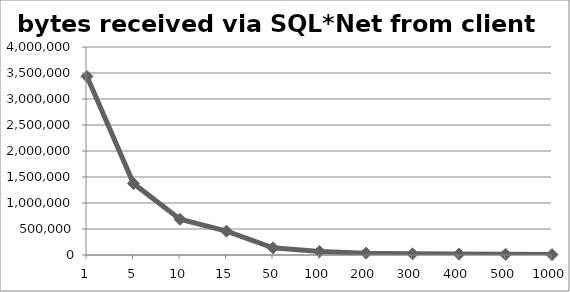
| Category | bytes received via SQL*Net from client |
|---|---|
| 1.0 | 3432842 |
| 5.0 | 1373367 |
| 10.0 | 686879 |
| 15.0 | 458046 |
| 50.0 | 137682 |
| 100.0 | 69031 |
| 200.0 | 34711 |
| 300.0 | 23271 |
| 400.0 | 17551 |
| 500.0 | 14119 |
| 1000.0 | 7255 |